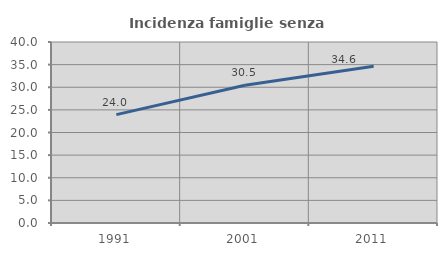
| Category | Incidenza famiglie senza nuclei |
|---|---|
| 1991.0 | 23.958 |
| 2001.0 | 30.457 |
| 2011.0 | 34.62 |